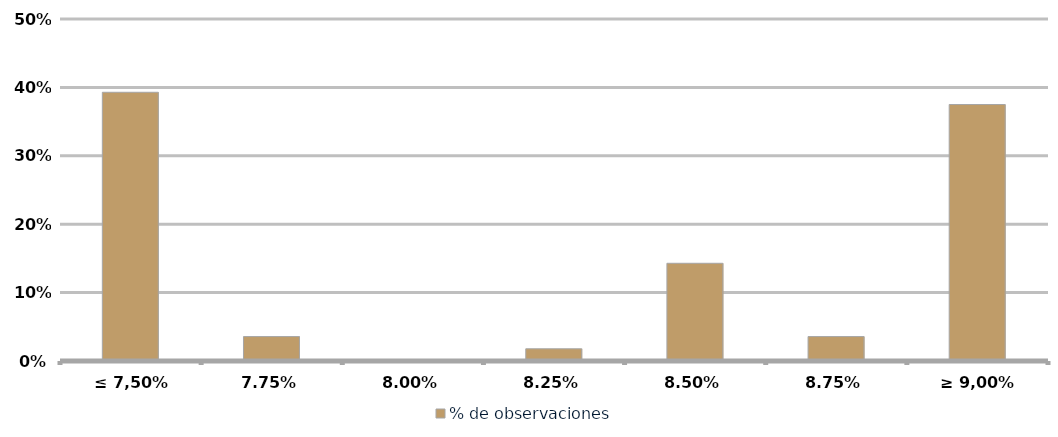
| Category | % de observaciones  |
|---|---|
| ≤ 7,50% | 0.393 |
| 7,75% | 0.036 |
| 8,00% | 0 |
| 8,25% | 0.018 |
| 8,50% | 0.143 |
| 8,75% | 0.036 |
| ≥ 9,00% | 0.375 |